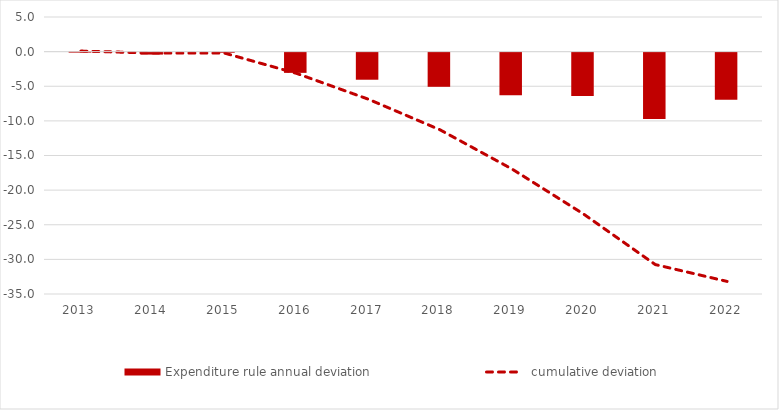
| Category | Expenditure rule |
|---|---|
| 2013.0 | 0.081 |
| 2014.0 | -0.282 |
| 2015.0 | -0.018 |
| 2016.0 | -2.923 |
| 2017.0 | -3.914 |
| 2018.0 | -4.935 |
| 2019.0 | -6.166 |
| 2020.0 | -6.261 |
| 2021.0 | -9.583 |
| 2022.0 | -6.799 |